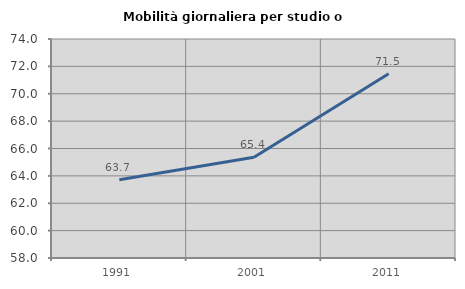
| Category | Mobilità giornaliera per studio o lavoro |
|---|---|
| 1991.0 | 63.71 |
| 2001.0 | 65.362 |
| 2011.0 | 71.458 |